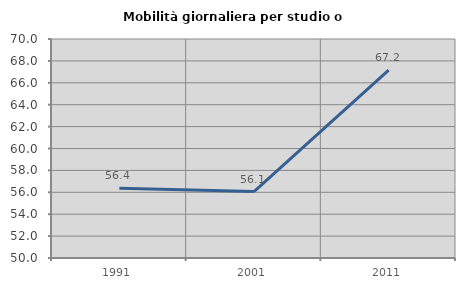
| Category | Mobilità giornaliera per studio o lavoro |
|---|---|
| 1991.0 | 56.37 |
| 2001.0 | 56.062 |
| 2011.0 | 67.162 |